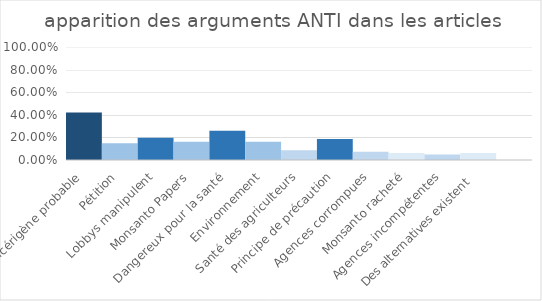
| Category | Series 0 |
|---|---|
| Cancérigène probable | 0.42 |
| Pétition | 0.148 |
| Lobbys manipulent | 0.198 |
| Monsanto Papers | 0.16 |
| Dangereux pour la santé | 0.259 |
| Environnement | 0.16 |
| Santé des agriculteurs | 0.086 |
| Principe de précaution | 0.185 |
| Agences corrompues | 0.074 |
| Monsanto racheté | 0.062 |
| Agences incompétentes | 0.049 |
| Des alternatives existent  | 0.062 |